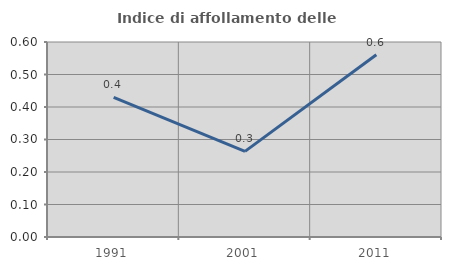
| Category | Indice di affollamento delle abitazioni  |
|---|---|
| 1991.0 | 0.43 |
| 2001.0 | 0.263 |
| 2011.0 | 0.561 |